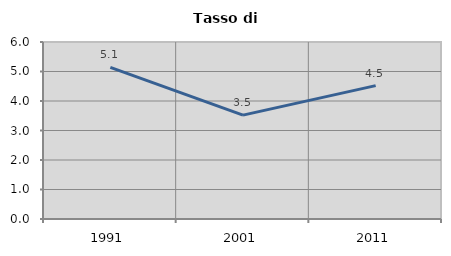
| Category | Tasso di disoccupazione   |
|---|---|
| 1991.0 | 5.137 |
| 2001.0 | 3.522 |
| 2011.0 | 4.521 |